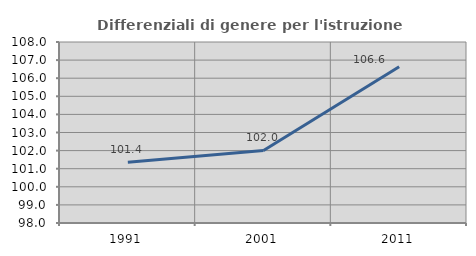
| Category | Differenziali di genere per l'istruzione superiore |
|---|---|
| 1991.0 | 101.362 |
| 2001.0 | 102.006 |
| 2011.0 | 106.627 |